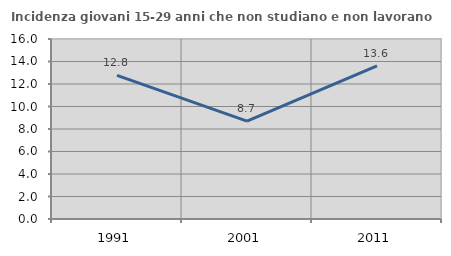
| Category | Incidenza giovani 15-29 anni che non studiano e non lavorano  |
|---|---|
| 1991.0 | 12.772 |
| 2001.0 | 8.696 |
| 2011.0 | 13.609 |